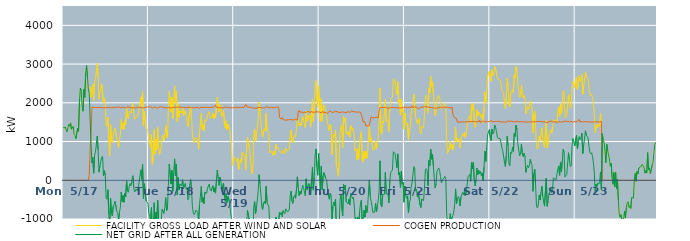
| Category | FACILITY GROSS LOAD AFTER WIND AND SOLAR | COGEN PRODUCTION | NET GRID AFTER ALL GENERATION |
|---|---|---|---|
|  Mon  5/17 | 1375 | 0 | 1375 |
|  Mon  5/17 | 1343 | 0 | 1343 |
|  Mon  5/17 | 1379 | 0 | 1379 |
|  Mon  5/17 | 1360 | 0 | 1360 |
|  Mon  5/17 | 1251 | 0 | 1251 |
|  Mon  5/17 | 1247 | 0 | 1247 |
|  Mon  5/17 | 1441 | 0 | 1441 |
|  Mon  5/17 | 1398 | 0 | 1398 |
|  Mon  5/17 | 1480 | 0 | 1480 |
|  Mon  5/17 | 1319 | 0 | 1319 |
|  Mon  5/17 | 1307 | 0 | 1307 |
|  Mon  5/17 | 1393 | 0 | 1393 |
|  Mon  5/17 | 1181 | 0 | 1181 |
|  Mon  5/17 | 1150 | 0 | 1150 |
|  Mon  5/17 | 1074 | 0 | 1074 |
|  Mon  5/17 | 1063 | 0 | 1063 |
|  Mon  5/17 | 1343 | 0 | 1343 |
|  Mon  5/17 | 1265 | 0 | 1265 |
|  Mon  5/17 | 2025 | 0 | 2025 |
|  Mon  5/17 | 2379 | 0 | 2379 |
|  Mon  5/17 | 2322 | 0 | 2322 |
|  Mon  5/17 | 1919 | 0 | 1919 |
|  Mon  5/17 | 1782 | 0 | 1782 |
|  Mon  5/17 | 2346 | 0 | 2346 |
|  Mon  5/17 | 2142 | 0 | 2142 |
|  Mon  5/17 | 2761 | 0 | 2761 |
|  Mon  5/17 | 2967 | 0 | 2967 |
|  Mon  5/17 | 2667 | 0 | 2667 |
|  Mon  5/17 | 2359 | 0 | 2359 |
|  Mon  5/17 | 2372 | 125 | 2247 |
|  Mon  5/17 | 2410 | 807 | 1603 |
|  Mon  5/17 | 2144 | 1194 | 950 |
|  Mon  5/17 | 2346 | 1897 | 449 |
|  Mon  5/17 | 2484 | 1893 | 591 |
|  Mon  5/17 | 2062 | 1879 | 183 |
|  Mon  5/17 | 2533 | 1883 | 650 |
|  Mon  5/17 | 2601 | 1877 | 724 |
|  Mon  5/17 | 2600 | 1883 | 717 |
|  Mon  5/17 | 3016 | 1878 | 1138 |
|  Mon  5/17 | 2670 | 1879 | 791 |
|  Mon  5/17 | 2091 | 1881 | 210 |
|  Mon  5/17 | 2272 | 1894 | 378 |
|  Mon  5/17 | 2372 | 1881 | 491 |
|  Mon  5/17 | 2487 | 1897 | 590 |
|  Mon  5/17 | 2488 | 1870 | 618 |
|  Mon  5/17 | 1995 | 1875 | 120 |
|  Mon  5/17 | 2120 | 1870 | 250 |
|  Mon  5/17 | 2014 | 1885 | 129 |
|  Mon  5/17 | 1420 | 1879 | -459 |
|  Mon  5/17 | 1384 | 1874 | -490 |
|  Mon  5/17 | 1633 | 1876 | -243 |
|  Mon  5/17 | 992 | 1871 | -879 |
|  Mon  5/17 | 635 | 1886 | -1251 |
|  Mon  5/17 | 1434 | 1896 | -462 |
|  Mon  5/17 | 1008 | 1871 | -863 |
|  Mon  5/17 | 963 | 1882 | -919 |
|  Mon  5/17 | 1207 | 1878 | -671 |
|  Mon  5/17 | 1228 | 1859 | -631 |
|  Mon  5/17 | 1342 | 1885 | -543 |
|  Mon  5/17 | 1355 | 1878 | -523 |
|  Mon  5/17 | 1072 | 1873 | -801 |
|  Mon  5/17 | 1036 | 1869 | -833 |
|  Mon  5/17 | 846 | 1901 | -1055 |
|  Mon  5/17 | 1049 | 1880 | -831 |
|  Mon  5/17 | 1172 | 1868 | -696 |
|  Mon  5/17 | 1569 | 1875 | -306 |
|  Mon  5/17 | 1333 | 1882 | -549 |
|  Mon  5/17 | 1483 | 1874 | -391 |
|  Mon  5/17 | 1316 | 1884 | -568 |
|  Mon  5/17 | 1538 | 1879 | -341 |
|  Mon  5/17 | 1439 | 1867 | -428 |
|  Mon  5/17 | 1861 | 1871 | -10 |
|  Mon  5/17 | 1623 | 1896 | -273 |
|  Mon  5/17 | 1592 | 1902 | -310 |
|  Mon  5/17 | 1735 | 1889 | -154 |
|  Mon  5/17 | 1784 | 1868 | -84 |
|  Mon  5/17 | 1736 | 1874 | -138 |
|  Mon  5/17 | 1883 | 1897 | -14 |
|  Mon  5/17 | 1987 | 1870 | 117 |
|  Mon  5/17 | 1722 | 1895 | -173 |
|  Mon  5/17 | 1571 | 1873 | -302 |
|  Mon  5/17 | 1580 | 1871 | -291 |
|  Mon  5/17 | 1633 | 1859 | -226 |
|  Mon  5/17 | 1631 | 1902 | -271 |
|  Mon  5/17 | 1687 | 1884 | -197 |
|  Mon  5/17 | 1819 | 1878 | -59 |
|  Mon  5/17 | 1834 | 1890 | -56 |
|  Mon  5/17 | 2146 | 1878 | 268 |
|  Mon  5/17 | 1913 | 1891 | 22 |
|  Mon  5/17 | 2288 | 1871 | 417 |
|  Mon  5/17 | 1415 | 1895 | -480 |
|  Mon  5/17 | 1786 | 1875 | -89 |
|  Mon  5/17 | 1799 | 1881 | -82 |
|  Mon  5/17 | 1344 | 1885 | -541 |
|  Mon  5/17 | 1340 | 1865 | -525 |
|  Mon  5/17 | 1305 | 1895 | -590 |
|  Tue  5/18 | 1018 | 1871 | -853 |
|  Tue  5/18 | 963 | 1897 | -934 |
|  Tue  5/18 | 841 | 1886 | -1045 |
|  Tue  5/18 | 1181 | 1887 | -706 |
|  Tue  5/18 | 404 | 1854 | -1450 |
|  Tue  5/18 | 587 | 1880 | -1293 |
|  Tue  5/18 | 1310 | 1891 | -581 |
|  Tue  5/18 | 676 | 1892 | -1216 |
|  Tue  5/18 | 1060 | 1885 | -825 |
|  Tue  5/18 | 781 | 1865 | -1084 |
|  Tue  5/18 | 1363 | 1882 | -519 |
|  Tue  5/18 | 862 | 1877 | -1015 |
|  Tue  5/18 | 661 | 1884 | -1223 |
|  Tue  5/18 | 772 | 1902 | -1130 |
|  Tue  5/18 | 862 | 1889 | -1027 |
|  Tue  5/18 | 1138 | 1884 | -746 |
|  Tue  5/18 | 1165 | 1894 | -729 |
|  Tue  5/18 | 1025 | 1881 | -856 |
|  Tue  5/18 | 1165 | 1873 | -708 |
|  Tue  5/18 | 1420 | 1868 | -448 |
|  Tue  5/18 | 1093 | 1875 | -782 |
|  Tue  5/18 | 1151 | 1875 | -724 |
|  Tue  5/18 | 1755 | 1896 | -141 |
|  Tue  5/18 | 2294 | 1876 | 418 |
|  Tue  5/18 | 2304 | 1870 | 434 |
|  Tue  5/18 | 1769 | 1867 | -98 |
|  Tue  5/18 | 2146 | 1886 | 260 |
|  Tue  5/18 | 1594 | 1875 | -281 |
|  Tue  5/18 | 2051 | 1863 | 188 |
|  Tue  5/18 | 2438 | 1886 | 552 |
|  Tue  5/18 | 1992 | 1882 | 110 |
|  Tue  5/18 | 2303 | 1883 | 420 |
|  Tue  5/18 | 1506 | 1881 | -375 |
|  Tue  5/18 | 1958 | 1889 | 69 |
|  Tue  5/18 | 1625 | 1875 | -250 |
|  Tue  5/18 | 1797 | 1891 | -94 |
|  Tue  5/18 | 1770 | 1886 | -116 |
|  Tue  5/18 | 1739 | 1879 | -140 |
|  Tue  5/18 | 1882 | 1867 | 15 |
|  Tue  5/18 | 1660 | 1879 | -219 |
|  Tue  5/18 | 1750 | 1877 | -127 |
|  Tue  5/18 | 1798 | 1878 | -80 |
|  Tue  5/18 | 1655 | 1882 | -227 |
|  Tue  5/18 | 1665 | 1863 | -198 |
|  Tue  5/18 | 1389 | 1895 | -506 |
|  Tue  5/18 | 1412 | 1879 | -467 |
|  Tue  5/18 | 1756 | 1880 | -124 |
|  Tue  5/18 | 1901 | 1883 | 18 |
|  Tue  5/18 | 1668 | 1877 | -209 |
|  Tue  5/18 | 1200 | 1875 | -675 |
|  Tue  5/18 | 1034 | 1872 | -838 |
|  Tue  5/18 | 965 | 1853 | -888 |
|  Tue  5/18 | 1030 | 1874 | -844 |
|  Tue  5/18 | 1104 | 1873 | -769 |
|  Tue  5/18 | 1125 | 1884 | -759 |
|  Tue  5/18 | 1056 | 1884 | -828 |
|  Tue  5/18 | 798 | 1876 | -1078 |
|  Tue  5/18 | 1212 | 1847 | -635 |
|  Tue  5/18 | 1467 | 1887 | -420 |
|  Tue  5/18 | 1726 | 1887 | -161 |
|  Tue  5/18 | 1316 | 1881 | -565 |
|  Tue  5/18 | 1441 | 1888 | -447 |
|  Tue  5/18 | 1278 | 1881 | -603 |
|  Tue  5/18 | 1558 | 1864 | -306 |
|  Tue  5/18 | 1573 | 1880 | -307 |
|  Tue  5/18 | 1547 | 1888 | -341 |
|  Tue  5/18 | 1681 | 1887 | -206 |
|  Tue  5/18 | 1724 | 1874 | -150 |
|  Tue  5/18 | 1776 | 1874 | -98 |
|  Tue  5/18 | 1620 | 1869 | -249 |
|  Tue  5/18 | 1610 | 1888 | -278 |
|  Tue  5/18 | 1617 | 1881 | -264 |
|  Tue  5/18 | 1741 | 1881 | -140 |
|  Tue  5/18 | 1583 | 1887 | -304 |
|  Tue  5/18 | 1707 | 1903 | -196 |
|  Tue  5/18 | 1613 | 1945 | -332 |
|  Tue  5/18 | 1866 | 1884 | -18 |
|  Tue  5/18 | 2143 | 1877 | 266 |
|  Tue  5/18 | 1922 | 1872 | 50 |
|  Tue  5/18 | 1757 | 1892 | -135 |
|  Tue  5/18 | 1950 | 1873 | 77 |
|  Tue  5/18 | 1884 | 1886 | -2 |
|  Tue  5/18 | 1648 | 1880 | -232 |
|  Tue  5/18 | 1704 | 1854 | -150 |
|  Tue  5/18 | 1815 | 1886 | -71 |
|  Tue  5/18 | 1471 | 1872 | -401 |
|  Tue  5/18 | 1348 | 1891 | -543 |
|  Tue  5/18 | 1536 | 1874 | -338 |
|  Tue  5/18 | 1303 | 1880 | -577 |
|  Tue  5/18 | 1442 | 1860 | -418 |
|  Tue  5/18 | 1451 | 1877 | -426 |
|  Tue  5/18 | 1301 | 1877 | -576 |
|  Tue  5/18 | 1042 | 1873 | -831 |
|  Tue  5/18 | 893 | 1885 | -992 |
|  Tue  5/18 | 384 | 1865 | -1481 |
|  Tue  5/18 | 451 | 1857 | -1406 |
|  Wed  5/19 | 607 | 1887 | -1280 |
|  Wed  5/19 | 575 | 1882 | -1307 |
|  Wed  5/19 | 567 | 1865 | -1298 |
|  Wed  5/19 | 494 | 1891 | -1397 |
|  Wed  5/19 | 577 | 1874 | -1297 |
|  Wed  5/19 | 267 | 1876 | -1609 |
|  Wed  5/19 | 377 | 1889 | -1512 |
|  Wed  5/19 | 547 | 1887 | -1340 |
|  Wed  5/19 | 454 | 1889 | -1435 |
|  Wed  5/19 | 719 | 1877 | -1158 |
|  Wed  5/19 | 731 | 1893 | -1162 |
|  Wed  5/19 | 685 | 1876 | -1191 |
|  Wed  5/19 | 605 | 1923 | -1318 |
|  Wed  5/19 | 272 | 1955 | -1683 |
|  Wed  5/19 | 847 | 1934 | -1087 |
|  Wed  5/19 | 1109 | 1886 | -777 |
|  Wed  5/19 | 1121 | 1875 | -754 |
|  Wed  5/19 | 848 | 1889 | -1041 |
|  Wed  5/19 | 664 | 1892 | -1228 |
|  Wed  5/19 | 388 | 1886 | -1498 |
|  Wed  5/19 | 165 | 1875 | -1710 |
|  Wed  5/19 | 261 | 1867 | -1606 |
|  Wed  5/19 | 1188 | 1882 | -694 |
|  Wed  5/19 | 1319 | 1868 | -549 |
|  Wed  5/19 | 1003 | 1868 | -865 |
|  Wed  5/19 | 1118 | 1849 | -731 |
|  Wed  5/19 | 1379 | 1886 | -507 |
|  Wed  5/19 | 1592 | 1878 | -286 |
|  Wed  5/19 | 2020 | 1877 | 143 |
|  Wed  5/19 | 1786 | 1869 | -83 |
|  Wed  5/19 | 1523 | 1878 | -355 |
|  Wed  5/19 | 1207 | 1885 | -678 |
|  Wed  5/19 | 1115 | 1868 | -753 |
|  Wed  5/19 | 1292 | 1874 | -582 |
|  Wed  5/19 | 1328 | 1870 | -542 |
|  Wed  5/19 | 1265 | 1878 | -613 |
|  Wed  5/19 | 1739 | 1896 | -157 |
|  Wed  5/19 | 1300 | 1878 | -578 |
|  Wed  5/19 | 1286 | 1887 | -601 |
|  Wed  5/19 | 1215 | 1901 | -686 |
|  Wed  5/19 | 703 | 1867 | -1164 |
|  Wed  5/19 | 706 | 1883 | -1177 |
|  Wed  5/19 | 759 | 1884 | -1125 |
|  Wed  5/19 | 781 | 1892 | -1111 |
|  Wed  5/19 | 635 | 1871 | -1236 |
|  Wed  5/19 | 754 | 1870 | -1116 |
|  Wed  5/19 | 668 | 1875 | -1207 |
|  Wed  5/19 | 929 | 1878 | -949 |
|  Wed  5/19 | 817 | 1896 | -1079 |
|  Wed  5/19 | 845 | 1881 | -1036 |
|  Wed  5/19 | 794 | 1885 | -1091 |
|  Wed  5/19 | 790 | 1621 | -831 |
|  Wed  5/19 | 737 | 1620 | -883 |
|  Wed  5/19 | 748 | 1576 | -828 |
|  Wed  5/19 | 681 | 1621 | -940 |
|  Wed  5/19 | 790 | 1572 | -782 |
|  Wed  5/19 | 771 | 1562 | -791 |
|  Wed  5/19 | 688 | 1552 | -864 |
|  Wed  5/19 | 833 | 1569 | -736 |
|  Wed  5/19 | 783 | 1557 | -774 |
|  Wed  5/19 | 750 | 1572 | -822 |
|  Wed  5/19 | 766 | 1561 | -795 |
|  Wed  5/19 | 815 | 1564 | -749 |
|  Wed  5/19 | 1163 | 1569 | -406 |
|  Wed  5/19 | 1292 | 1574 | -282 |
|  Wed  5/19 | 1029 | 1561 | -532 |
|  Wed  5/19 | 966 | 1564 | -598 |
|  Wed  5/19 | 1135 | 1555 | -420 |
|  Wed  5/19 | 1162 | 1549 | -387 |
|  Wed  5/19 | 1114 | 1578 | -464 |
|  Wed  5/19 | 1317 | 1569 | -252 |
|  Wed  5/19 | 1640 | 1551 | 89 |
|  Wed  5/19 | 1567 | 1758 | -191 |
|  Wed  5/19 | 1410 | 1804 | -394 |
|  Wed  5/19 | 1470 | 1756 | -286 |
|  Wed  5/19 | 1399 | 1756 | -357 |
|  Wed  5/19 | 1520 | 1763 | -243 |
|  Wed  5/19 | 1643 | 1769 | -126 |
|  Wed  5/19 | 1553 | 1740 | -187 |
|  Wed  5/19 | 1459 | 1766 | -307 |
|  Wed  5/19 | 1362 | 1760 | -398 |
|  Wed  5/19 | 1783 | 1745 | 38 |
|  Wed  5/19 | 1524 | 1772 | -248 |
|  Wed  5/19 | 1582 | 1763 | -181 |
|  Wed  5/19 | 1686 | 1771 | -85 |
|  Wed  5/19 | 1656 | 1754 | -98 |
|  Wed  5/19 | 1375 | 1746 | -371 |
|  Wed  5/19 | 1795 | 1789 | 6 |
|  Wed  5/19 | 2096 | 1756 | 340 |
|  Wed  5/19 | 1515 | 1770 | -255 |
|  Wed  5/19 | 1819 | 1757 | 62 |
|  Wed  5/19 | 2386 | 1765 | 621 |
|  Wed  5/19 | 2573 | 1765 | 808 |
|  Wed  5/19 | 2096 | 1746 | 350 |
|  Wed  5/19 | 1897 | 1767 | 130 |
|  Wed  5/19 | 2441 | 1749 | 692 |
|  Thu  5/20 | 2451 | 1761 | 690 |
|  Thu  5/20 | 1505 | 1753 | -248 |
|  Thu  5/20 | 2105 | 1742 | 363 |
|  Thu  5/20 | 1525 | 1771 | -246 |
|  Thu  5/20 | 1875 | 1770 | 105 |
|  Thu  5/20 | 1953 | 1753 | 200 |
|  Thu  5/20 | 1961 | 1751 | 210 |
|  Thu  5/20 | 1796 | 1753 | 43 |
|  Thu  5/20 | 1784 | 1772 | 12 |
|  Thu  5/20 | 1488 | 1719 | -231 |
|  Thu  5/20 | 1353 | 1758 | -405 |
|  Thu  5/20 | 1281 | 1770 | -489 |
|  Thu  5/20 | 1448 | 1785 | -337 |
|  Thu  5/20 | 1394 | 1771 | -377 |
|  Thu  5/20 | 663 | 1757 | -1094 |
|  Thu  5/20 | 1070 | 1738 | -668 |
|  Thu  5/20 | 1195 | 1757 | -562 |
|  Thu  5/20 | 1118 | 1773 | -655 |
|  Thu  5/20 | 1297 | 1786 | -489 |
|  Thu  5/20 | 338 | 1762 | -1424 |
|  Thu  5/20 | 282 | 1766 | -1484 |
|  Thu  5/20 | 106 | 1750 | -1644 |
|  Thu  5/20 | 464 | 1753 | -1289 |
|  Thu  5/20 | 1223 | 1757 | -534 |
|  Thu  5/20 | 1393 | 1754 | -361 |
|  Thu  5/20 | 1431 | 1774 | -343 |
|  Thu  5/20 | 847 | 1766 | -919 |
|  Thu  5/20 | 1653 | 1764 | -111 |
|  Thu  5/20 | 1512 | 1752 | -240 |
|  Thu  5/20 | 1610 | 1733 | -123 |
|  Thu  5/20 | 1200 | 1751 | -551 |
|  Thu  5/20 | 1226 | 1762 | -536 |
|  Thu  5/20 | 1160 | 1771 | -611 |
|  Thu  5/20 | 1259 | 1750 | -491 |
|  Thu  5/20 | 1112 | 1752 | -640 |
|  Thu  5/20 | 1415 | 1759 | -344 |
|  Thu  5/20 | 1401 | 1789 | -388 |
|  Thu  5/20 | 1295 | 1767 | -472 |
|  Thu  5/20 | 1335 | 1771 | -436 |
|  Thu  5/20 | 1118 | 1766 | -648 |
|  Thu  5/20 | 764 | 1769 | -1005 |
|  Thu  5/20 | 806 | 1768 | -962 |
|  Thu  5/20 | 529 | 1754 | -1225 |
|  Thu  5/20 | 812 | 1767 | -955 |
|  Thu  5/20 | 544 | 1766 | -1222 |
|  Thu  5/20 | 923 | 1747 | -824 |
|  Thu  5/20 | 1143 | 1755 | -612 |
|  Thu  5/20 | 1255 | 1771 | -516 |
|  Thu  5/20 | 522 | 1628 | -1106 |
|  Thu  5/20 | 466 | 1509 | -1043 |
|  Thu  5/20 | 741 | 1513 | -772 |
|  Thu  5/20 | 559 | 1510 | -951 |
|  Thu  5/20 | 756 | 1409 | -653 |
|  Thu  5/20 | 567 | 1408 | -841 |
|  Thu  5/20 | 679 | 1405 | -726 |
|  Thu  5/20 | 1088 | 1420 | -332 |
|  Thu  5/20 | 1421 | 1413 | 8 |
|  Thu  5/20 | 998 | 1410 | -412 |
|  Thu  5/20 | 1097 | 1639 | -542 |
|  Thu  5/20 | 954 | 1631 | -677 |
|  Thu  5/20 | 777 | 1606 | -829 |
|  Thu  5/20 | 761 | 1587 | -826 |
|  Thu  5/20 | 797 | 1619 | -822 |
|  Thu  5/20 | 1015 | 1608 | -593 |
|  Thu  5/20 | 810 | 1629 | -819 |
|  Thu  5/20 | 947 | 1618 | -671 |
|  Thu  5/20 | 1099 | 1612 | -513 |
|  Thu  5/20 | 1516 | 1802 | -286 |
|  Thu  5/20 | 2380 | 1878 | 502 |
|  Thu  5/20 | 1251 | 1884 | -633 |
|  Thu  5/20 | 1189 | 1877 | -688 |
|  Thu  5/20 | 1518 | 1888 | -370 |
|  Thu  5/20 | 1490 | 1882 | -392 |
|  Thu  5/20 | 1507 | 1871 | -364 |
|  Thu  5/20 | 2086 | 1879 | 207 |
|  Thu  5/20 | 1528 | 1881 | -353 |
|  Thu  5/20 | 1518 | 1869 | -351 |
|  Thu  5/20 | 1525 | 1879 | -354 |
|  Thu  5/20 | 1261 | 1845 | -584 |
|  Thu  5/20 | 1863 | 1881 | -18 |
|  Thu  5/20 | 2064 | 1868 | 196 |
|  Thu  5/20 | 2056 | 1878 | 178 |
|  Thu  5/20 | 2148 | 1878 | 270 |
|  Thu  5/20 | 2617 | 1880 | 737 |
|  Thu  5/20 | 2626 | 1878 | 748 |
|  Thu  5/20 | 2562 | 1873 | 689 |
|  Thu  5/20 | 2571 | 1867 | 704 |
|  Thu  5/20 | 2203 | 1877 | 326 |
|  Thu  5/20 | 2545 | 1864 | 681 |
|  Thu  5/20 | 2004 | 1868 | 136 |
|  Thu  5/20 | 2094 | 1881 | 213 |
|  Thu  5/20 | 1680 | 1868 | -188 |
|  Thu  5/20 | 2099 | 1864 | 235 |
|  Thu  5/20 | 1773 | 1874 | -101 |
|  Thu  5/20 | 1844 | 1896 | -52 |
|  Thu  5/20 | 1322 | 1888 | -566 |
|  Fri  5/21 | 1738 | 1888 | -150 |
|  Fri  5/21 | 1489 | 1889 | -400 |
|  Fri  5/21 | 1418 | 1884 | -466 |
|  Fri  5/21 | 1470 | 1873 | -403 |
|  Fri  5/21 | 1049 | 1890 | -841 |
|  Fri  5/21 | 1307 | 1888 | -581 |
|  Fri  5/21 | 1380 | 1891 | -511 |
|  Fri  5/21 | 1698 | 1881 | -183 |
|  Fri  5/21 | 1855 | 1924 | -69 |
|  Fri  5/21 | 2009 | 1875 | 134 |
|  Fri  5/21 | 2223 | 1871 | 352 |
|  Fri  5/21 | 2217 | 1893 | 324 |
|  Fri  5/21 | 1637 | 1916 | -279 |
|  Fri  5/21 | 1650 | 1884 | -234 |
|  Fri  5/21 | 1462 | 1891 | -429 |
|  Fri  5/21 | 1556 | 1852 | -296 |
|  Fri  5/21 | 1600 | 1875 | -275 |
|  Fri  5/21 | 1235 | 1869 | -634 |
|  Fri  5/21 | 1193 | 1898 | -705 |
|  Fri  5/21 | 1390 | 1873 | -483 |
|  Fri  5/21 | 1414 | 1884 | -470 |
|  Fri  5/21 | 1343 | 1871 | -528 |
|  Fri  5/21 | 1696 | 1898 | -202 |
|  Fri  5/21 | 2138 | 1874 | 264 |
|  Fri  5/21 | 2198 | 1899 | 299 |
|  Fri  5/21 | 2127 | 1875 | 252 |
|  Fri  5/21 | 1748 | 1887 | -139 |
|  Fri  5/21 | 2385 | 1873 | 512 |
|  Fri  5/21 | 2257 | 1883 | 374 |
|  Fri  5/21 | 2681 | 1879 | 802 |
|  Fri  5/21 | 2422 | 1879 | 543 |
|  Fri  5/21 | 2547 | 1870 | 677 |
|  Fri  5/21 | 2238 | 1867 | 371 |
|  Fri  5/21 | 1958 | 1889 | 69 |
|  Fri  5/21 | 1664 | 1864 | -200 |
|  Fri  5/21 | 1782 | 1879 | -97 |
|  Fri  5/21 | 2091 | 1865 | 226 |
|  Fri  5/21 | 2084 | 1878 | 206 |
|  Fri  5/21 | 2193 | 1874 | 319 |
|  Fri  5/21 | 2126 | 1872 | 254 |
|  Fri  5/21 | 1987 | 1892 | 95 |
|  Fri  5/21 | 1835 | 1893 | -58 |
|  Fri  5/21 | 1868 | 1864 | 4 |
|  Fri  5/21 | 1876 | 1881 | -5 |
|  Fri  5/21 | 1953 | 1892 | 61 |
|  Fri  5/21 | 1986 | 1883 | 103 |
|  Fri  5/21 | 1905 | 1879 | 26 |
|  Fri  5/21 | 1020 | 1884 | -864 |
|  Fri  5/21 | 696 | 1885 | -1189 |
|  Fri  5/21 | 705 | 1882 | -1177 |
|  Fri  5/21 | 832 | 1876 | -1044 |
|  Fri  5/21 | 1010 | 1874 | -864 |
|  Fri  5/21 | 818 | 1859 | -1041 |
|  Fri  5/21 | 923 | 1893 | -970 |
|  Fri  5/21 | 787 | 1697 | -910 |
|  Fri  5/21 | 894 | 1708 | -814 |
|  Fri  5/21 | 992 | 1610 | -618 |
|  Fri  5/21 | 1371 | 1593 | -222 |
|  Fri  5/21 | 991 | 1594 | -603 |
|  Fri  5/21 | 1009 | 1504 | -495 |
|  Fri  5/21 | 1087 | 1510 | -423 |
|  Fri  5/21 | 1029 | 1500 | -471 |
|  Fri  5/21 | 840 | 1503 | -663 |
|  Fri  5/21 | 1072 | 1503 | -431 |
|  Fri  5/21 | 1091 | 1514 | -423 |
|  Fri  5/21 | 1202 | 1514 | -312 |
|  Fri  5/21 | 1147 | 1524 | -377 |
|  Fri  5/21 | 1239 | 1499 | -260 |
|  Fri  5/21 | 1100 | 1506 | -406 |
|  Fri  5/21 | 1208 | 1515 | -307 |
|  Fri  5/21 | 1215 | 1522 | -307 |
|  Fri  5/21 | 1600 | 1511 | 89 |
|  Fri  5/21 | 1611 | 1507 | 104 |
|  Fri  5/21 | 1664 | 1512 | 152 |
|  Fri  5/21 | 1475 | 1503 | -28 |
|  Fri  5/21 | 1971 | 1514 | 457 |
|  Fri  5/21 | 1797 | 1507 | 290 |
|  Fri  5/21 | 1996 | 1524 | 472 |
|  Fri  5/21 | 1519 | 1510 | 9 |
|  Fri  5/21 | 1366 | 1508 | -142 |
|  Fri  5/21 | 1514 | 1506 | 8 |
|  Fri  5/21 | 1822 | 1510 | 312 |
|  Fri  5/21 | 1659 | 1513 | 146 |
|  Fri  5/21 | 1764 | 1510 | 254 |
|  Fri  5/21 | 1727 | 1554 | 173 |
|  Fri  5/21 | 1721 | 1490 | 231 |
|  Fri  5/21 | 1616 | 1502 | 114 |
|  Fri  5/21 | 1713 | 1521 | 192 |
|  Fri  5/21 | 1492 | 1499 | -7 |
|  Fri  5/21 | 1863 | 1525 | 338 |
|  Fri  5/21 | 2286 | 1531 | 755 |
|  Fri  5/21 | 1991 | 1503 | 488 |
|  Fri  5/21 | 2328 | 1491 | 837 |
|  Fri  5/21 | 2691 | 1520 | 1171 |
|  Fri  5/21 | 2678 | 1516 | 1162 |
|  Fri  5/21 | 2820 | 1507 | 1313 |
|  Sat  5/22 | 2641 | 1538 | 1103 |
|  Sat  5/22 | 2551 | 1526 | 1025 |
|  Sat  5/22 | 2852 | 1533 | 1319 |
|  Sat  5/22 | 2700 | 1500 | 1200 |
|  Sat  5/22 | 2731 | 1503 | 1228 |
|  Sat  5/22 | 2942 | 1519 | 1423 |
|  Sat  5/22 | 2878 | 1513 | 1365 |
|  Sat  5/22 | 2775 | 1517 | 1258 |
|  Sat  5/22 | 2636 | 1522 | 1114 |
|  Sat  5/22 | 2607 | 1526 | 1081 |
|  Sat  5/22 | 2617 | 1512 | 1105 |
|  Sat  5/22 | 2590 | 1512 | 1078 |
|  Sat  5/22 | 2500 | 1512 | 988 |
|  Sat  5/22 | 2349 | 1508 | 841 |
|  Sat  5/22 | 2287 | 1522 | 765 |
|  Sat  5/22 | 2261 | 1504 | 757 |
|  Sat  5/22 | 1990 | 1520 | 470 |
|  Sat  5/22 | 1856 | 1503 | 353 |
|  Sat  5/22 | 2143 | 1512 | 631 |
|  Sat  5/22 | 2639 | 1506 | 1133 |
|  Sat  5/22 | 2435 | 1540 | 895 |
|  Sat  5/22 | 1941 | 1520 | 421 |
|  Sat  5/22 | 1890 | 1515 | 375 |
|  Sat  5/22 | 2232 | 1510 | 722 |
|  Sat  5/22 | 2220 | 1526 | 694 |
|  Sat  5/22 | 2359 | 1505 | 854 |
|  Sat  5/22 | 2255 | 1510 | 745 |
|  Sat  5/22 | 2721 | 1514 | 1207 |
|  Sat  5/22 | 2640 | 1508 | 1132 |
|  Sat  5/22 | 2937 | 1518 | 1419 |
|  Sat  5/22 | 2844 | 1529 | 1315 |
|  Sat  5/22 | 2474 | 1521 | 953 |
|  Sat  5/22 | 2293 | 1510 | 783 |
|  Sat  5/22 | 2134 | 1505 | 629 |
|  Sat  5/22 | 2174 | 1509 | 665 |
|  Sat  5/22 | 2462 | 1524 | 938 |
|  Sat  5/22 | 2209 | 1520 | 689 |
|  Sat  5/22 | 2128 | 1517 | 611 |
|  Sat  5/22 | 2193 | 1493 | 700 |
|  Sat  5/22 | 2136 | 1524 | 612 |
|  Sat  5/22 | 1711 | 1507 | 204 |
|  Sat  5/22 | 1815 | 1497 | 318 |
|  Sat  5/22 | 1909 | 1520 | 389 |
|  Sat  5/22 | 1828 | 1503 | 325 |
|  Sat  5/22 | 1896 | 1519 | 377 |
|  Sat  5/22 | 2053 | 1510 | 543 |
|  Sat  5/22 | 1958 | 1516 | 442 |
|  Sat  5/22 | 1895 | 1506 | 389 |
|  Sat  5/22 | 1227 | 1514 | -287 |
|  Sat  5/22 | 1684 | 1509 | 175 |
|  Sat  5/22 | 1786 | 1500 | 286 |
|  Sat  5/22 | 1371 | 1514 | -143 |
|  Sat  5/22 | 850 | 1515 | -665 |
|  Sat  5/22 | 806 | 1518 | -712 |
|  Sat  5/22 | 872 | 1512 | -640 |
|  Sat  5/22 | 1136 | 1520 | -384 |
|  Sat  5/22 | 1019 | 1529 | -510 |
|  Sat  5/22 | 1194 | 1519 | -325 |
|  Sat  5/22 | 1354 | 1508 | -154 |
|  Sat  5/22 | 1096 | 1506 | -410 |
|  Sat  5/22 | 932 | 1496 | -564 |
|  Sat  5/22 | 844 | 1511 | -667 |
|  Sat  5/22 | 836 | 1505 | -669 |
|  Sat  5/22 | 1544 | 1490 | 54 |
|  Sat  5/22 | 842 | 1514 | -672 |
|  Sat  5/22 | 977 | 1502 | -525 |
|  Sat  5/22 | 1151 | 1507 | -356 |
|  Sat  5/22 | 1219 | 1515 | -296 |
|  Sat  5/22 | 1307 | 1508 | -201 |
|  Sat  5/22 | 1217 | 1531 | -314 |
|  Sat  5/22 | 1262 | 1504 | -242 |
|  Sat  5/22 | 1575 | 1511 | 64 |
|  Sat  5/22 | 1543 | 1506 | 37 |
|  Sat  5/22 | 1549 | 1515 | 34 |
|  Sat  5/22 | 1533 | 1517 | 16 |
|  Sat  5/22 | 1499 | 1486 | 13 |
|  Sat  5/22 | 1797 | 1501 | 296 |
|  Sat  5/22 | 1885 | 1516 | 369 |
|  Sat  5/22 | 1643 | 1515 | 128 |
|  Sat  5/22 | 1967 | 1501 | 466 |
|  Sat  5/22 | 1721 | 1502 | 219 |
|  Sat  5/22 | 2017 | 1506 | 511 |
|  Sat  5/22 | 2311 | 1510 | 801 |
|  Sat  5/22 | 2240 | 1520 | 720 |
|  Sat  5/22 | 1618 | 1533 | 85 |
|  Sat  5/22 | 1601 | 1529 | 72 |
|  Sat  5/22 | 1674 | 1523 | 151 |
|  Sat  5/22 | 1673 | 1517 | 156 |
|  Sat  5/22 | 2219 | 1508 | 711 |
|  Sat  5/22 | 2038 | 1510 | 528 |
|  Sat  5/22 | 1849 | 1498 | 351 |
|  Sat  5/22 | 1900 | 1522 | 378 |
|  Sat  5/22 | 2417 | 1525 | 892 |
|  Sat  5/22 | 2566 | 1490 | 1076 |
|  Sat  5/22 | 2512 | 1517 | 995 |
|  Sat  5/22 | 2393 | 1506 | 887 |
|  Sun  5/23 | 2411 | 1508 | 903 |
|  Sun  5/23 | 2663 | 1504 | 1159 |
|  Sun  5/23 | 2332 | 1523 | 809 |
|  Sun  5/23 | 2505 | 1506 | 999 |
|  Sun  5/23 | 2696 | 1571 | 1125 |
|  Sun  5/23 | 2558 | 1503 | 1055 |
|  Sun  5/23 | 2596 | 1505 | 1091 |
|  Sun  5/23 | 2730 | 1517 | 1213 |
|  Sun  5/23 | 2219 | 1529 | 690 |
|  Sun  5/23 | 2406 | 1504 | 902 |
|  Sun  5/23 | 2581 | 1516 | 1065 |
|  Sun  5/23 | 2790 | 1513 | 1277 |
|  Sun  5/23 | 2660 | 1495 | 1165 |
|  Sun  5/23 | 2646 | 1512 | 1134 |
|  Sun  5/23 | 2601 | 1510 | 1091 |
|  Sun  5/23 | 2380 | 1505 | 875 |
|  Sun  5/23 | 2239 | 1514 | 725 |
|  Sun  5/23 | 2188 | 1504 | 684 |
|  Sun  5/23 | 2225 | 1515 | 710 |
|  Sun  5/23 | 2110 | 1502 | 608 |
|  Sun  5/23 | 1966 | 1504 | 462 |
|  Sun  5/23 | 1689 | 1504 | 185 |
|  Sun  5/23 | 1230 | 1514 | -284 |
|  Sun  5/23 | 1416 | 1512 | -96 |
|  Sun  5/23 | 1358 | 1515 | -157 |
|  Sun  5/23 | 1442 | 1508 | -66 |
|  Sun  5/23 | 1386 | 1486 | -100 |
|  Sun  5/23 | 1452 | 1505 | -53 |
|  Sun  5/23 | 1727 | 1511 | 216 |
|  Sun  5/23 | 1271 | 1524 | -253 |
|  Sun  5/23 | 1204 | 0 | 1204 |
|  Sun  5/23 | 1030 | 0 | 1030 |
|  Sun  5/23 | 991 | 0 | 991 |
|  Sun  5/23 | 758 | 0 | 758 |
|  Sun  5/23 | 454 | 0 | 454 |
|  Sun  5/23 | 927 | 0 | 927 |
|  Sun  5/23 | 778 | 0 | 778 |
|  Sun  5/23 | 644 | 0 | 644 |
|  Sun  5/23 | 551 | 0 | 551 |
|  Sun  5/23 | 360 | 0 | 360 |
|  Sun  5/23 | 439 | 0 | 439 |
|  Sun  5/23 | 65 | 0 | 65 |
|  Sun  5/23 | -106 | 0 | -106 |
|  Sun  5/23 | 201 | 0 | 201 |
|  Sun  5/23 | -172 | 0 | -172 |
|  Sun  5/23 | 205 | 0 | 205 |
|  Sun  5/23 | -221 | 0 | -221 |
|  Sun  5/23 | 20 | 0 | 20 |
|  Sun  5/23 | -507 | 0 | -507 |
|  Sun  5/23 | -871 | 0 | -871 |
|  Sun  5/23 | -962 | 0 | -962 |
|  Sun  5/23 | -888 | 0 | -888 |
|  Sun  5/23 | -1010 | 0 | -1010 |
|  Sun  5/23 | -1065 | 0 | -1065 |
|  Sun  5/23 | -997 | 0 | -997 |
|  Sun  5/23 | -799 | 0 | -799 |
|  Sun  5/23 | -972 | 0 | -972 |
|  Sun  5/23 | -714 | 0 | -714 |
|  Sun  5/23 | -582 | 0 | -582 |
|  Sun  5/23 | -553 | 0 | -553 |
|  Sun  5/23 | -703 | 0 | -703 |
|  Sun  5/23 | -661 | 0 | -661 |
|  Sun  5/23 | -727 | 0 | -727 |
|  Sun  5/23 | -450 | 0 | -450 |
|  Sun  5/23 | -444 | 0 | -444 |
|  Sun  5/23 | -464 | 0 | -464 |
|  Sun  5/23 | 3 | 0 | 3 |
|  Sun  5/23 | 178 | 0 | 178 |
|  Sun  5/23 | -29 | 0 | -29 |
|  Sun  5/23 | 224 | 0 | 224 |
|  Sun  5/23 | 163 | 0 | 163 |
|  Sun  5/23 | 317 | 0 | 317 |
|  Sun  5/23 | 323 | 0 | 323 |
|  Sun  5/23 | 344 | 0 | 344 |
|  Sun  5/23 | 358 | 0 | 358 |
|  Sun  5/23 | 411 | 0 | 411 |
|  Sun  5/23 | 365 | 0 | 365 |
|  Sun  5/23 | 314 | 0 | 314 |
|  Sun  5/23 | 184 | 0 | 184 |
|  Sun  5/23 | 251 | 0 | 251 |
|  Sun  5/23 | 192 | 0 | 192 |
|  Sun  5/23 | 713 | 0 | 713 |
|  Sun  5/23 | 270 | 0 | 270 |
|  Sun  5/23 | 321 | 0 | 321 |
|  Sun  5/23 | 164 | 0 | 164 |
|  Sun  5/23 | 177 | 0 | 177 |
|  Sun  5/23 | 391 | 0 | 391 |
|  Sun  5/23 | 456 | 0 | 456 |
|  Sun  5/23 | 692 | 0 | 692 |
|  Sun  5/23 | 925 | 0 | 925 |
|  Sun  5/23 | 917 | 0 | 917 |
|  Sun  5/23 | 998 | 0 | 998 |